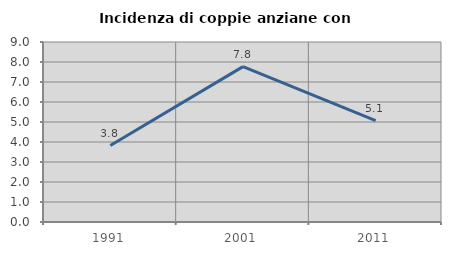
| Category | Incidenza di coppie anziane con figli |
|---|---|
| 1991.0 | 3.823 |
| 2001.0 | 7.767 |
| 2011.0 | 5.074 |